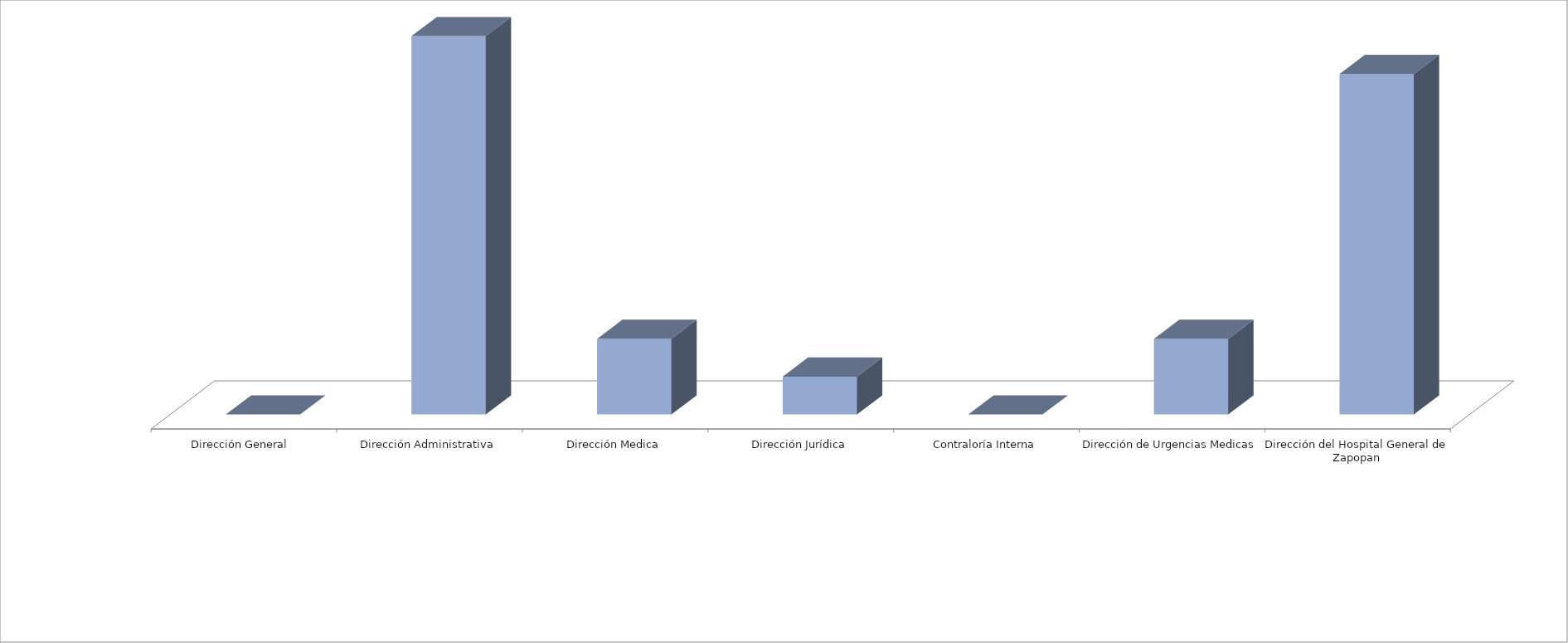
| Category | Series 0 | Series 1 |
|---|---|---|
| Dirección General  |  | 0 |
| Dirección Administrativa |  | 10 |
| Dirección Medica |  | 2 |
| Dirección Jurídica |  | 1 |
| Contraloría Interna |  | 0 |
| Dirección de Urgencias Medicas |  | 2 |
| Dirección del Hospital General de Zapopan |  | 9 |